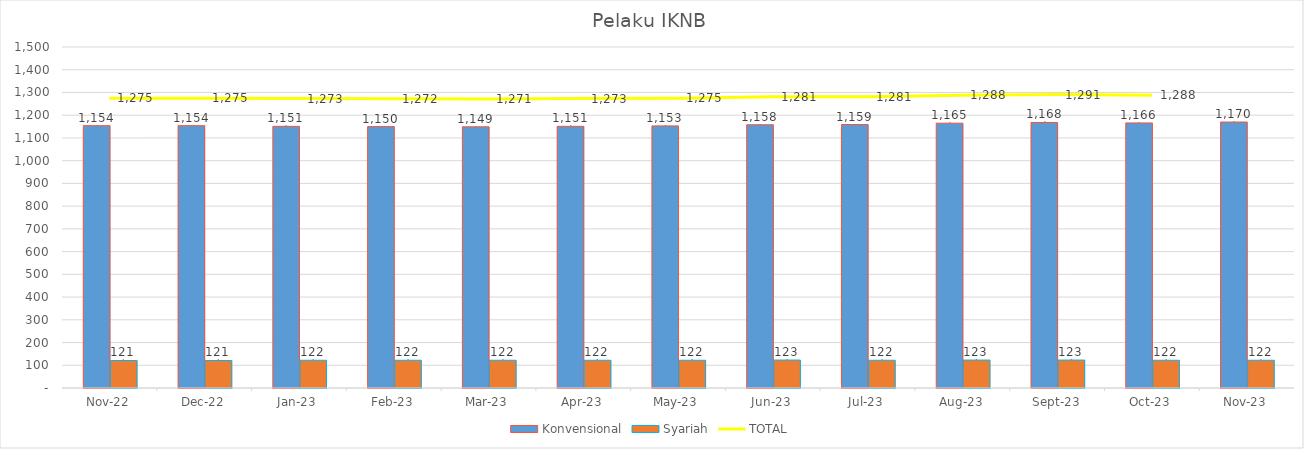
| Category |  Konvensional  |  Syariah  |
|---|---|---|
| 2022-11-01 | 1154 | 121 |
| 2022-12-01 | 1154 | 121 |
| 2023-01-01 | 1151 | 122 |
| 2023-02-01 | 1150 | 122 |
| 2023-03-01 | 1149 | 122 |
| 2023-04-01 | 1151 | 122 |
| 2023-05-01 | 1153 | 122 |
| 2023-06-01 | 1158 | 123 |
| 2023-07-01 | 1159 | 122 |
| 2023-08-01 | 1165 | 123 |
| 2023-09-01 | 1168 | 123 |
| 2023-10-31 | 1166 | 122 |
| 2023-11-01 | 1170 | 122 |